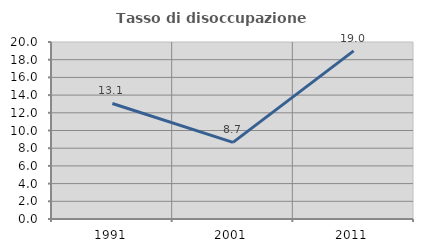
| Category | Tasso di disoccupazione giovanile  |
|---|---|
| 1991.0 | 13.052 |
| 2001.0 | 8.659 |
| 2011.0 | 18.998 |